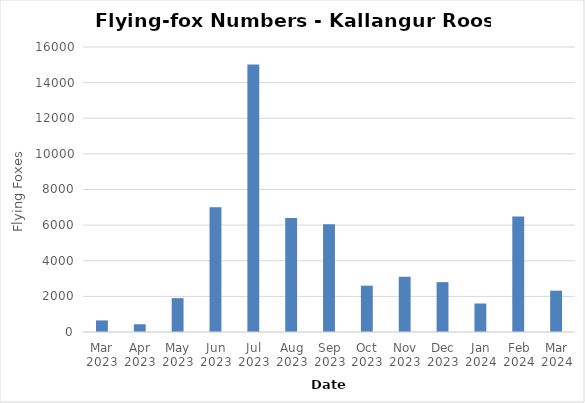
| Category | Flying-foxes |
|---|---|
| Mar 2023 | 650 |
| Apr 2023 | 435 |
| May 2023 | 1900 |
| Jun 2023 | 7000 |
| Jul 2023 | 15015 |
| Aug 2023 | 6400 |
| Sep 2023 | 6050 |
| Oct 2023 | 2601 |
| Nov 2023 | 3100 |
| Dec 2023 | 2800 |
| Jan 2024 | 1600 |
| Feb 2024 | 6480 |
| Mar 2024 | 2321 |